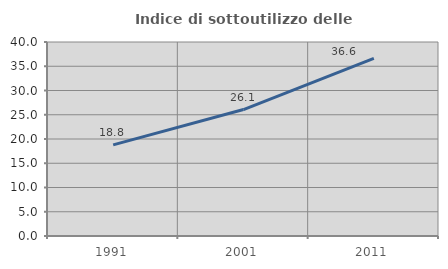
| Category | Indice di sottoutilizzo delle abitazioni  |
|---|---|
| 1991.0 | 18.78 |
| 2001.0 | 26.077 |
| 2011.0 | 36.603 |